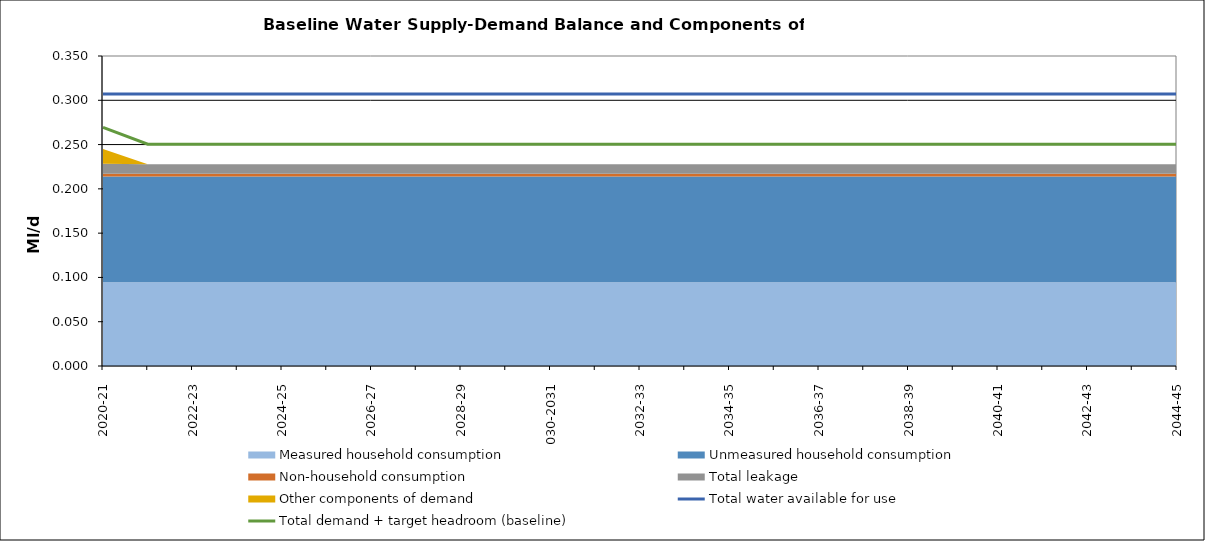
| Category | Total water available for use | Total demand + target headroom (baseline) |
|---|---|---|
| 0 | 0.307 | 0.269 |
| 1 | 0.307 | 0.25 |
| 2 | 0.307 | 0.25 |
| 3 | 0.307 | 0.25 |
| 4 | 0.307 | 0.25 |
| 5 | 0.307 | 0.25 |
| 6 | 0.307 | 0.25 |
| 7 | 0.307 | 0.25 |
| 8 | 0.307 | 0.25 |
| 9 | 0.307 | 0.25 |
| 10 | 0.307 | 0.25 |
| 11 | 0.307 | 0.25 |
| 12 | 0.307 | 0.25 |
| 13 | 0.307 | 0.25 |
| 14 | 0.307 | 0.25 |
| 15 | 0.307 | 0.25 |
| 16 | 0.307 | 0.25 |
| 17 | 0.307 | 0.25 |
| 18 | 0.307 | 0.25 |
| 19 | 0.307 | 0.25 |
| 20 | 0.307 | 0.25 |
| 21 | 0.307 | 0.25 |
| 22 | 0.307 | 0.25 |
| 23 | 0.307 | 0.25 |
| 24 | 0.307 | 0.25 |